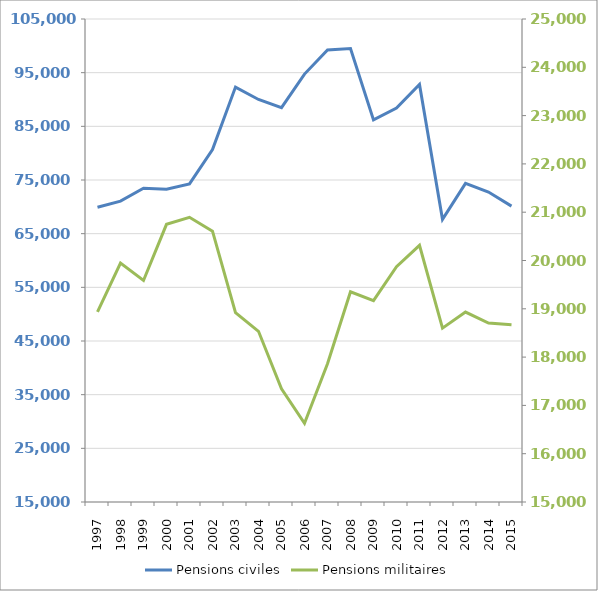
| Category | Pensions civiles |
|---|---|
| 1997.0 | 69921 |
| 1998.0 | 71066 |
| 1999.0 | 73472 |
| 2000.0 | 73280 |
| 2001.0 | 74269 |
| 2002.0 | 80689 |
| 2003.0 | 92316 |
| 2004.0 | 90002 |
| 2005.0 | 88483 |
| 2006.0 | 94737 |
| 2007.0 | 99237 |
| 2008.0 | 99508 |
| 2009.0 | 86199 |
| 2010.0 | 88410 |
| 2011.0 | 92810 |
| 2012.0 | 67670 |
| 2013.0 | 74367 |
| 2014.0 | 72763 |
| 2015.0 | 70136 |